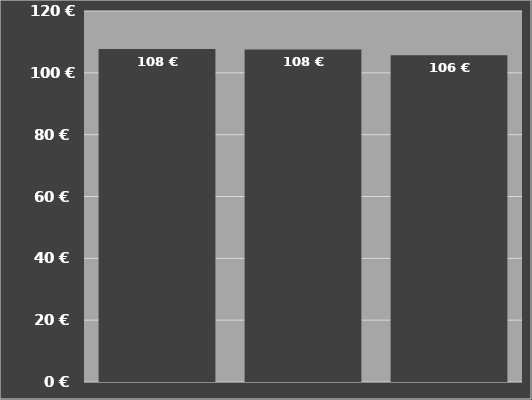
| Category | Kosten je Hektar
inklusive Schlepper |
|---|---|
| Case IH 7250
Axial Flow | 107.746 |
| Case IH 8250
Axial Flow | 107.568 |
| Case IH 9250
Axial Flow | 105.72 |